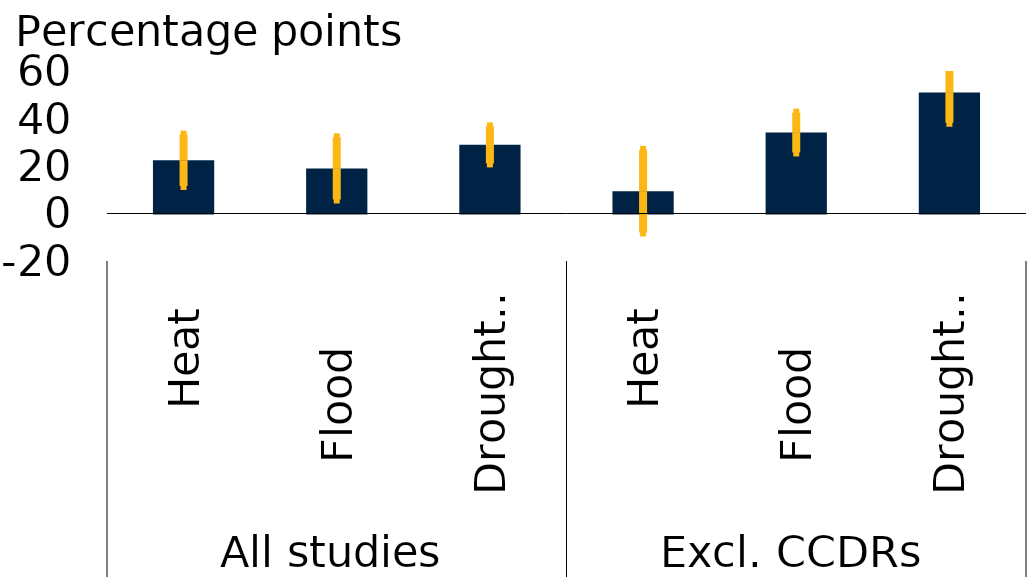
| Category | coefficient estimate |
|---|---|
| 0 | 22.4 |
| 1 | 19 |
| 2 | 28.9 |
| 3 | 9.4 |
| 4 | 34.1 |
| 5 | 50.9 |